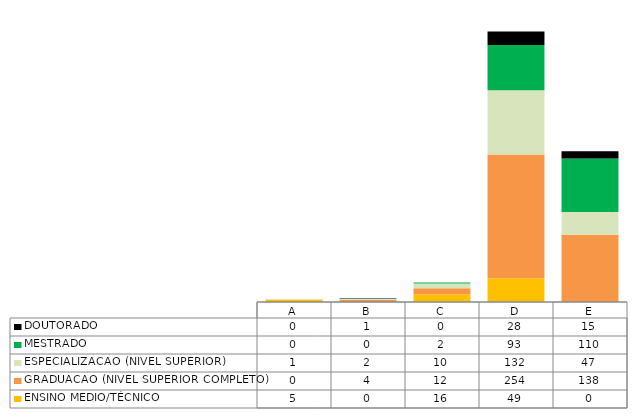
| Category | ENSINO MEDIO/TÉCNICO | GRADUACAO (NIVEL SUPERIOR COMPLETO) | ESPECIALIZACAO (NIVEL SUPERIOR) | MESTRADO | DOUTORADO |
|---|---|---|---|---|---|
| A | 5 | 0 | 1 | 0 | 0 |
| B | 0 | 4 | 2 | 0 | 1 |
| C | 16 | 12 | 10 | 2 | 0 |
| D | 49 | 254 | 132 | 93 | 28 |
| E | 0 | 138 | 47 | 110 | 15 |